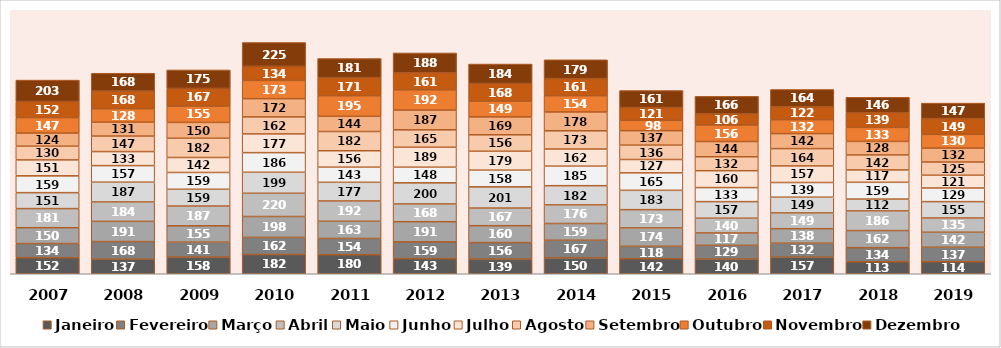
| Category | Janeiro | Fevereiro | Março | Abril | Maio | Junho | Julho | Agosto | Setembro | Outubro | Novembro | Dezembro |
|---|---|---|---|---|---|---|---|---|---|---|---|---|
| 2007 | 152 | 134 | 150 | 181 | 151 | 159 | 151 | 130 | 124 | 147 | 152 | 203 |
| 2008 | 137 | 168 | 191 | 184 | 187 | 157 | 133 | 147 | 131 | 128 | 168 | 168 |
| 2009 | 158 | 141 | 155 | 187 | 159 | 159 | 142 | 182 | 150 | 155 | 167 | 175 |
| 2010 | 182 | 162 | 198 | 220 | 199 | 186 | 177 | 162 | 172 | 173 | 134 | 225 |
| 2011 | 180 | 154 | 163 | 192 | 177 | 143 | 156 | 182 | 144 | 195 | 171 | 181 |
| 2012 | 143 | 159 | 191 | 168 | 200 | 148 | 189 | 165 | 187 | 192 | 161 | 188 |
| 2013 | 139 | 156 | 160 | 167 | 201 | 158 | 179 | 156 | 169 | 149 | 168 | 184 |
| 2014 | 150 | 167 | 159 | 176 | 182 | 185 | 162 | 173 | 178 | 154 | 161 | 179 |
| 2015 | 142 | 118 | 174 | 173 | 183 | 165 | 127 | 136 | 137 | 98 | 121 | 161 |
| 2016 | 140 | 129 | 117 | 140 | 157 | 133 | 160 | 132 | 144 | 156 | 106 | 166 |
| 2017 | 157 | 132 | 138 | 149 | 149 | 139 | 157 | 164 | 142 | 132 | 122 | 164 |
| 2018 | 113 | 134 | 162 | 186 | 112 | 159 | 117 | 142 | 128 | 133 | 139 | 146 |
| 2019 | 114 | 137 | 142 | 135 | 155 | 129 | 121 | 125 | 132 | 130 | 149 | 147 |